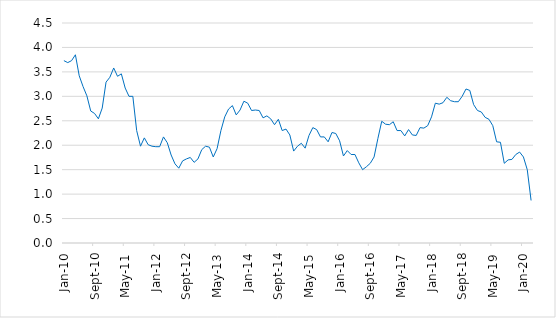
| Category | Series 0 |
|---|---|
| 2010-01-01 | 3.73 |
| 2010-02-01 | 3.69 |
| 2010-03-01 | 3.73 |
| 2010-04-01 | 3.85 |
| 2010-05-01 | 3.42 |
| 2010-06-01 | 3.2 |
| 2010-07-01 | 3.01 |
| 2010-08-01 | 2.7 |
| 2010-09-01 | 2.65 |
| 2010-10-01 | 2.54 |
| 2010-11-01 | 2.76 |
| 2010-12-01 | 3.29 |
| 2011-01-01 | 3.39 |
| 2011-02-01 | 3.58 |
| 2011-03-01 | 3.41 |
| 2011-04-01 | 3.46 |
| 2011-05-01 | 3.17 |
| 2011-06-01 | 3 |
| 2011-07-01 | 3 |
| 2011-08-01 | 2.3 |
| 2011-09-01 | 1.98 |
| 2011-10-01 | 2.15 |
| 2011-11-01 | 2.01 |
| 2011-12-01 | 1.98 |
| 2012-01-01 | 1.97 |
| 2012-02-01 | 1.97 |
| 2012-03-01 | 2.17 |
| 2012-04-01 | 2.05 |
| 2012-05-01 | 1.8 |
| 2012-06-01 | 1.62 |
| 2012-07-01 | 1.53 |
| 2012-08-01 | 1.68 |
| 2012-09-01 | 1.72 |
| 2012-10-01 | 1.75 |
| 2012-11-01 | 1.65 |
| 2012-12-01 | 1.72 |
| 2013-01-01 | 1.91 |
| 2013-02-01 | 1.98 |
| 2013-03-01 | 1.96 |
| 2013-04-01 | 1.76 |
| 2013-05-01 | 1.93 |
| 2013-06-01 | 2.3 |
| 2013-07-01 | 2.58 |
| 2013-08-01 | 2.74 |
| 2013-09-01 | 2.81 |
| 2013-10-01 | 2.62 |
| 2013-11-01 | 2.72 |
| 2013-12-01 | 2.9 |
| 2014-01-01 | 2.86 |
| 2014-02-01 | 2.71 |
| 2014-03-01 | 2.72 |
| 2014-04-01 | 2.71 |
| 2014-05-01 | 2.56 |
| 2014-06-01 | 2.6 |
| 2014-07-01 | 2.54 |
| 2014-08-01 | 2.42 |
| 2014-09-01 | 2.53 |
| 2014-10-01 | 2.3 |
| 2014-11-01 | 2.33 |
| 2014-12-01 | 2.21 |
| 2015-01-01 | 1.88 |
| 2015-02-01 | 1.98 |
| 2015-03-01 | 2.04 |
| 2015-04-01 | 1.94 |
| 2015-05-01 | 2.2 |
| 2015-06-01 | 2.36 |
| 2015-07-01 | 2.32 |
| 2015-08-01 | 2.17 |
| 2015-09-01 | 2.17 |
| 2015-10-01 | 2.07 |
| 2015-11-01 | 2.26 |
| 2015-12-01 | 2.24 |
| 2016-01-01 | 2.09 |
| 2016-02-01 | 1.78 |
| 2016-03-01 | 1.89 |
| 2016-04-01 | 1.81 |
| 2016-05-01 | 1.81 |
| 2016-06-01 | 1.64 |
| 2016-07-01 | 1.5 |
| 2016-08-01 | 1.56 |
| 2016-09-01 | 1.63 |
| 2016-10-01 | 1.76 |
| 2016-11-01 | 2.14 |
| 2016-12-01 | 2.49 |
| 2017-01-01 | 2.43 |
| 2017-02-01 | 2.42 |
| 2017-03-01 | 2.48 |
| 2017-04-01 | 2.3 |
| 2017-05-01 | 2.3 |
| 2017-06-01 | 2.19 |
| 2017-07-01 | 2.32 |
| 2017-08-01 | 2.21 |
| 2017-09-01 | 2.2 |
| 2017-10-01 | 2.36 |
| 2017-11-01 | 2.35 |
| 2017-12-01 | 2.4 |
| 2018-01-01 | 2.58 |
| 2018-02-01 | 2.86 |
| 2018-03-01 | 2.84 |
| 2018-04-01 | 2.87 |
| 2018-05-01 | 2.98 |
| 2018-06-01 | 2.91 |
| 2018-07-01 | 2.89 |
| 2018-08-01 | 2.89 |
| 2018-09-01 | 3 |
| 2018-10-01 | 3.15 |
| 2018-11-01 | 3.12 |
| 2018-12-01 | 2.83 |
| 2019-01-01 | 2.71 |
| 2019-02-01 | 2.68 |
| 2019-03-01 | 2.57 |
| 2019-04-01 | 2.53 |
| 2019-05-01 | 2.4 |
| 2019-06-01 | 2.07 |
| 2019-07-01 | 2.06 |
| 2019-08-01 | 1.63 |
| 2019-09-01 | 1.7 |
| 2019-10-01 | 1.71 |
| 2019-11-01 | 1.81 |
| 2019-12-01 | 1.86 |
| 2020-01-01 | 1.76 |
| 2020-02-01 | 1.5 |
| 2020-03-01 | 0.87 |